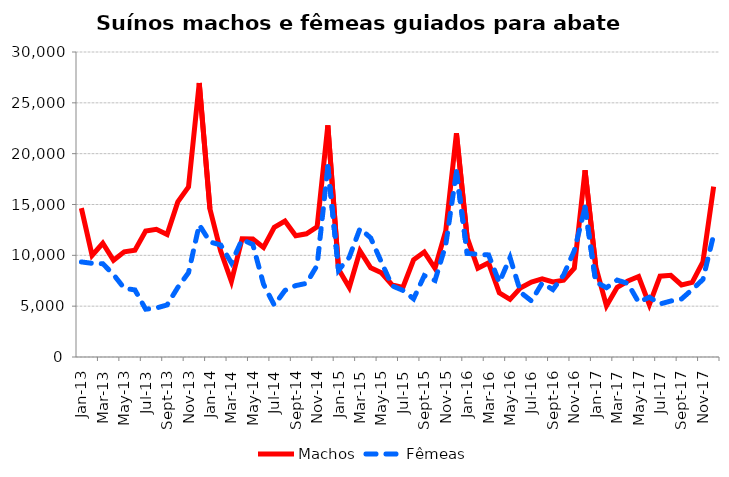
| Category | Machos | Fêmeas |
|---|---|---|
| 2013-01-01 | 14642 | 9351 |
| 2013-02-01 | 9996 | 9214 |
| 2013-03-01 | 11187 | 9178 |
| 2013-04-01 | 9518 | 8102 |
| 2013-05-01 | 10346 | 6767 |
| 2013-06-01 | 10498 | 6594 |
| 2013-07-01 | 12384 | 4704 |
| 2013-08-01 | 12558 | 4820 |
| 2013-09-01 | 12052 | 5119 |
| 2013-10-01 | 15259 | 6846 |
| 2013-11-01 | 16734 | 8296 |
| 2013-12-01 | 26948 | 13007 |
| 2014-01-01 | 14556 | 11317 |
| 2014-02-01 | 10424 | 11019 |
| 2014-03-01 | 7446 | 9259 |
| 2014-04-01 | 11630 | 11555 |
| 2014-05-01 | 11609 | 11069 |
| 2014-06-01 | 10773 | 7150 |
| 2014-07-01 | 12752 | 5104 |
| 2014-08-01 | 13365 | 6547 |
| 2014-09-01 | 11920 | 7024 |
| 2014-10-01 | 12116 | 7242 |
| 2014-11-01 | 12813 | 9011 |
| 2014-12-01 | 22783 | 18724 |
| 2015-01-01 | 8631 | 8534 |
| 2015-02-01 | 6844 | 9811 |
| 2015-03-01 | 10434 | 12635 |
| 2015-04-01 | 8780 | 11709 |
| 2015-05-01 | 8280 | 9326 |
| 2015-06-01 | 7091 | 7000 |
| 2015-07-01 | 6838 | 6554 |
| 2015-08-01 | 9566 | 5723 |
| 2015-09-01 | 10321 | 8003 |
| 2015-10-01 | 8724 | 7529 |
| 2015-11-01 | 12395 | 11012 |
| 2015-12-01 | 22011 | 18216 |
| 2016-01-01 | 11741 | 10193 |
| 2016-02-01 | 8726 | 10098 |
| 2016-03-01 | 9264 | 10042 |
| 2016-04-01 | 6306 | 7331 |
| 2016-05-01 | 5665 | 9778 |
| 2016-06-01 | 6819 | 6339 |
| 2016-07-01 | 7378 | 5516 |
| 2016-08-01 | 7679 | 7278 |
| 2016-09-01 | 7386 | 6630 |
| 2016-10-01 | 7555 | 8072 |
| 2016-11-01 | 8740 | 10463 |
| 2016-12-01 | 18362 | 14719 |
| 2017-01-01 | 8882 | 7385 |
| 2017-02-01 | 5031 | 6817 |
| 2017-03-01 | 6855 | 7565 |
| 2017-04-01 | 7472 | 7231 |
| 2017-05-01 | 7915 | 5383 |
| 2017-06-01 | 5155 | 5883 |
| 2017-07-01 | 7949 | 5215 |
| 2017-08-01 | 8039 | 5506 |
| 2017-09-01 | 7090 | 5708 |
| 2017-10-01 | 7337 | 6640 |
| 2017-11-01 | 9348 | 7626 |
| 2017-12-01 | 16749 | 12009 |